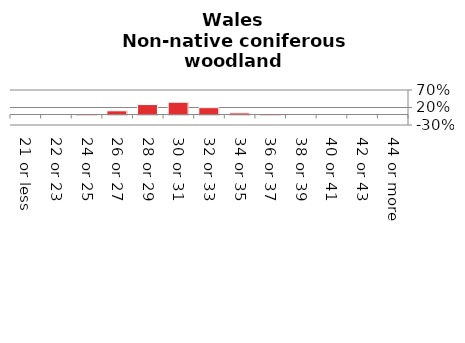
| Category | Non-native coniferous woodland |
|---|---|
| 21 or less | 0 |
| 22 or 23 | 0 |
| 24 or 25 | 0.011 |
| 26 or 27 | 0.106 |
| 28 or 29 | 0.284 |
| 30 or 31 | 0.351 |
| 32 or 33 | 0.195 |
| 34 or 35 | 0.047 |
| 36 or 37 | 0.007 |
| 38 or 39 | 0 |
| 40 or 41 | 0 |
| 42 or 43 | 0 |
| 44 or more | 0 |